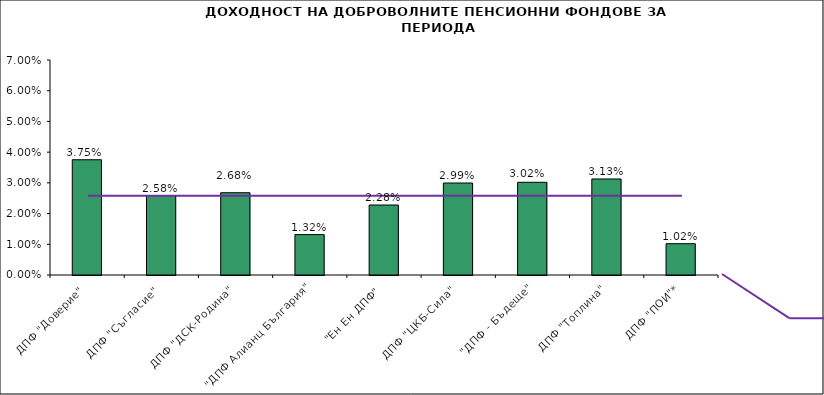
| Category | Series 0 |
|---|---|
| ДПФ "Доверие"  | 0.038 |
| ДПФ "Съгласие"  | 0.026 |
| ДПФ "ДСК-Родина"  | 0.027 |
| "ДПФ Алианц България"  | 0.013 |
| "Ен Ен ДПФ"  | 0.023 |
| ДПФ "ЦКБ-Сила"  | 0.03 |
| "ДПФ - Бъдеще" | 0.03 |
| ДПФ "Топлина" | 0.031 |
| ДПФ "ПОИ"* | 0.01 |